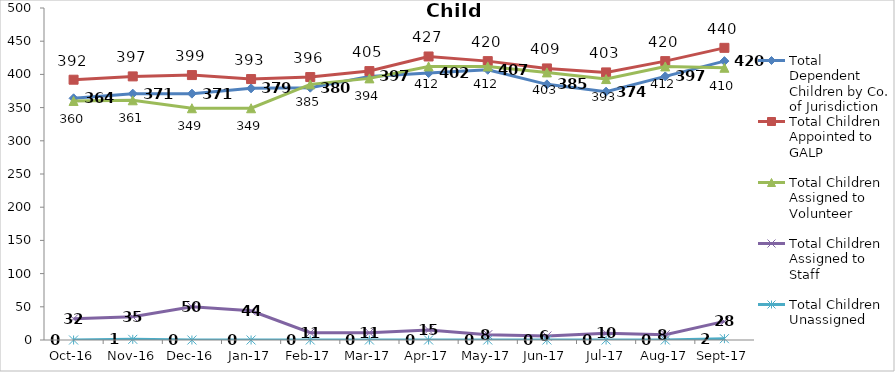
| Category | Total Dependent Children by Co. of Jurisdiction | Total Children Appointed to GALP | Total Children Assigned to Volunteer | Total Children Assigned to Staff | Total Children Unassigned |
|---|---|---|---|---|---|
| 2016-10-01 | 364 | 392 | 360 | 32 | 0 |
| 2016-11-01 | 371 | 397 | 361 | 35 | 1 |
| 2016-12-01 | 371 | 399 | 349 | 50 | 0 |
| 2017-01-01 | 379 | 393 | 349 | 44 | 0 |
| 2017-02-01 | 380 | 396 | 385 | 11 | 0 |
| 2017-03-01 | 397 | 405 | 394 | 11 | 0 |
| 2017-04-01 | 402 | 427 | 412 | 15 | 0 |
| 2017-05-01 | 407 | 420 | 412 | 8 | 0 |
| 2017-06-01 | 385 | 409 | 403 | 6 | 0 |
| 2017-07-01 | 374 | 403 | 393 | 10 | 0 |
| 2017-08-01 | 397 | 420 | 412 | 8 | 0 |
| 2017-09-01 | 420 | 440 | 410 | 28 | 2 |